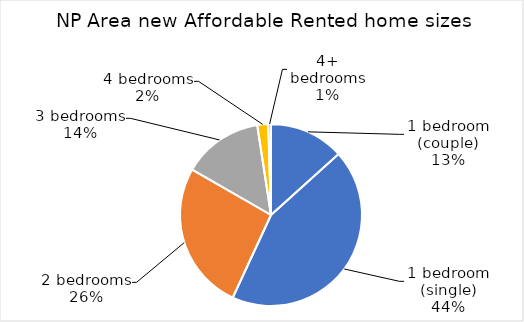
| Category | Series 0 |
|---|---|
| 1 bedroom (couple) | 55 |
| 1 bedroom (single) | 180 |
| 2 bedrooms | 109 |
| 3 bedrooms | 59 |
| 4 bedrooms | 8 |
| 4+ bedrooms | 2 |